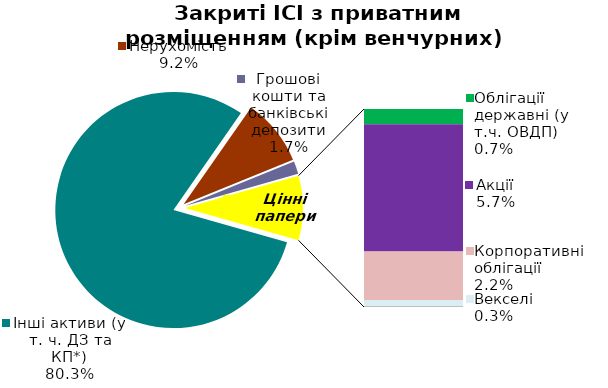
| Category | Series 0 |
|---|---|
| Інші активи (у т. ч. ДЗ та КП*) | 0.803 |
| Нерухомість | 0.092 |
| Грошові кошти та банківські депозити | 0.017 |
| Банківські метали | 0 |
| Облігації державні (у т.ч. ОВДП) | 0.007 |
| Облігації місцевих позик | 0 |
| Акції | 0.057 |
| Корпоративні облігації | 0.022 |
| Векселі | 0.003 |
| Інші ЦП та деривативи | 0 |